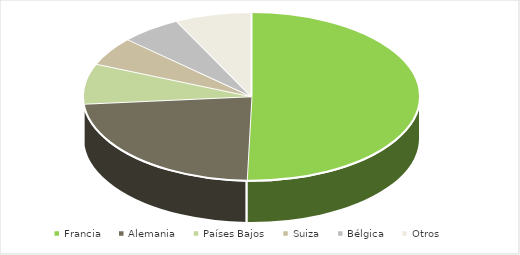
| Category | Series 0 |
|---|---|
| Francia | 0.505 |
| Alemania | 0.232 |
| Países Bajos | 0.077 |
| Suiza | 0.055 |
| Bélgica | 0.058 |
| Otros | 0.073 |